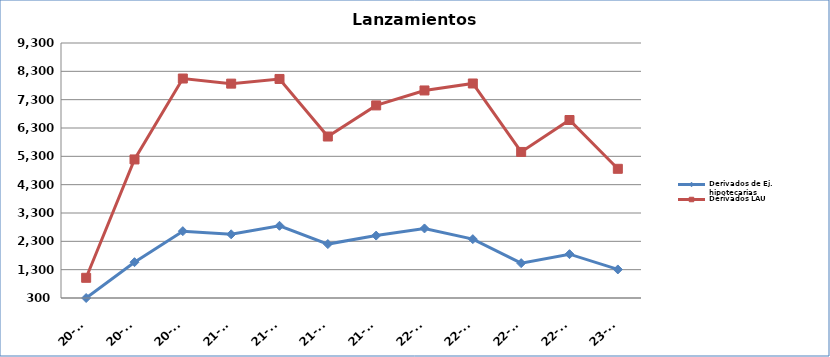
| Category | Derivados de Ej. hipotecarias | Derivados LAU |
|---|---|---|
| 20-T2 | 300 | 1013 |
| 20-T3 | 1564 | 5190 |
| 20-T4 | 2659 | 8046 |
| 21-T1 | 2548 | 7866 |
| 21-T2 | 2849 | 8031 |
| 21-T3 | 2203 | 5999 |
| 21-T4 | 2503 | 7097 |
| 22-T1 | 2755 | 7625 |
| 22-T2 | 2377 | 7871 |
| 22-T3 | 1530 | 5455 |
| 22-T4 | 1847 | 6582 |
| 23-T1 | 1308 | 4860 |